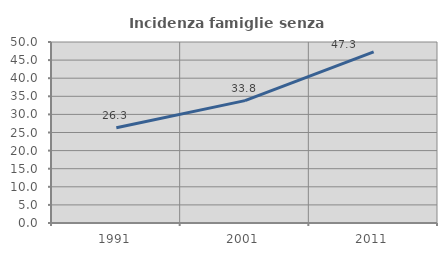
| Category | Incidenza famiglie senza nuclei |
|---|---|
| 1991.0 | 26.334 |
| 2001.0 | 33.805 |
| 2011.0 | 47.267 |